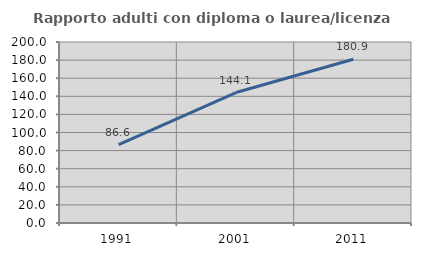
| Category | Rapporto adulti con diploma o laurea/licenza media  |
|---|---|
| 1991.0 | 86.643 |
| 2001.0 | 144.13 |
| 2011.0 | 180.933 |